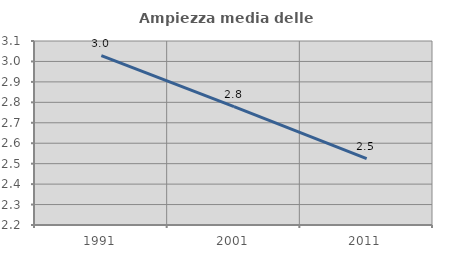
| Category | Ampiezza media delle famiglie |
|---|---|
| 1991.0 | 3.029 |
| 2001.0 | 2.779 |
| 2011.0 | 2.525 |